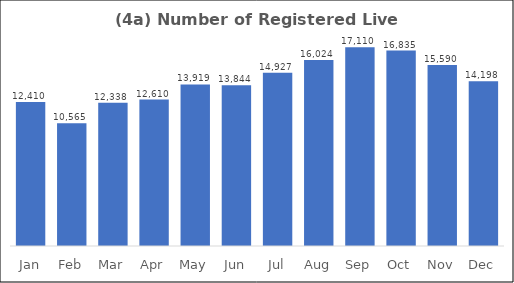
| Category | Series 0 |
|---|---|
| Jan | 12410 |
| Feb | 10565 |
| Mar | 12338 |
| Apr | 12610 |
| May | 13919 |
| Jun | 13844 |
| Jul | 14927 |
| Aug | 16024 |
| Sep | 17110 |
| Oct | 16835 |
| Nov | 15590 |
| Dec | 14198 |